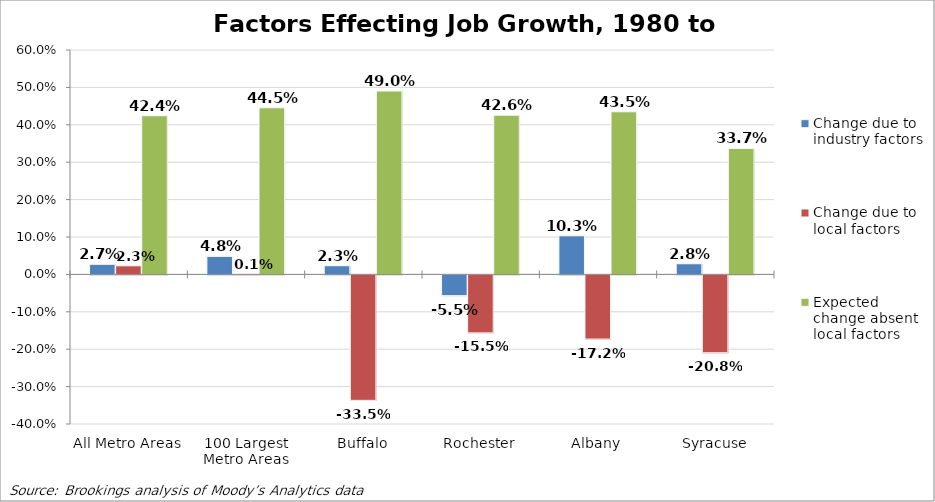
| Category | Change due to industry factors | Change due to local factors | Expected change absent local factors |
|---|---|---|---|
| All Metro Areas | 0.027 | 0.023 | 0.424 |
| 100 Largest Metro Areas | 0.048 | 0.001 | 0.445 |
| Buffalo | 0.023 | -0.335 | 0.49 |
| Rochester | -0.055 | -0.155 | 0.426 |
| Albany | 0.103 | -0.172 | 0.435 |
| Syracuse | 0.028 | -0.208 | 0.337 |